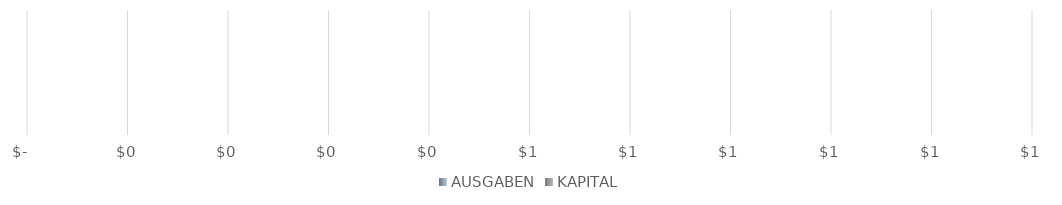
| Category | AUSGABEN | KAPITAL |
|---|---|---|
| 0 | 0 | 0 |